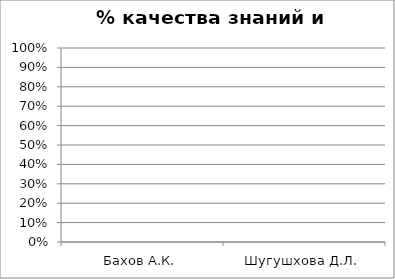
| Category | Series 0 | 2 |
|---|---|---|
| Бахов А.К. | 0 | 0 |
| Шугушхова Д.Л. | 0 | 0 |